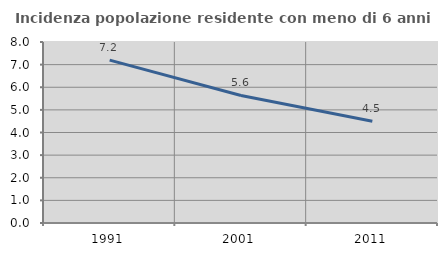
| Category | Incidenza popolazione residente con meno di 6 anni |
|---|---|
| 1991.0 | 7.198 |
| 2001.0 | 5.638 |
| 2011.0 | 4.497 |